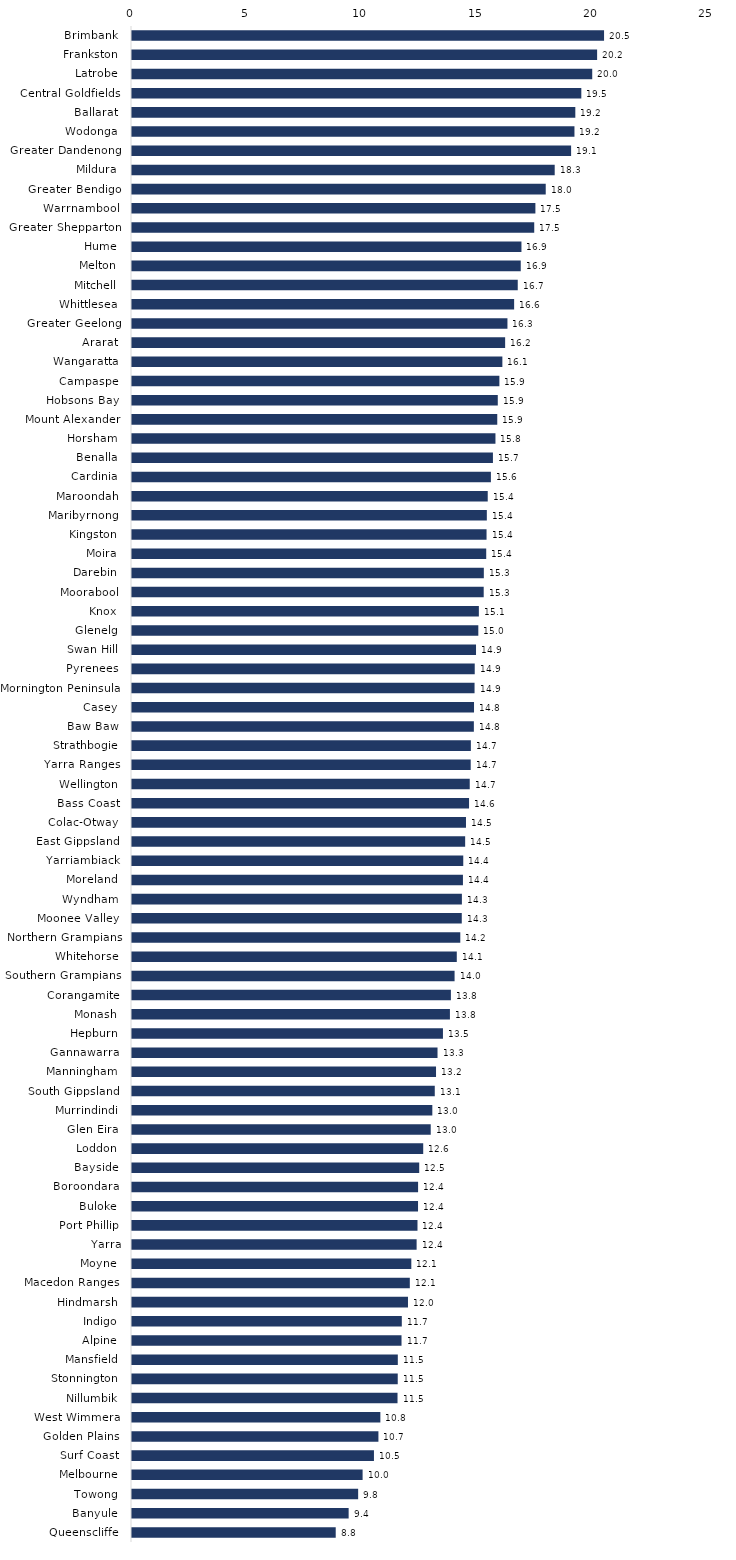
| Category | Series 0 |
|---|---|
| Brimbank  | 20.488 |
| Frankston  | 20.187 |
| Latrobe  | 19.975 |
| Central Goldfields  | 19.502 |
| Ballarat  | 19.241 |
| Wodonga  | 19.204 |
| Greater Dandenong  | 19.058 |
| Mildura  | 18.347 |
| Greater Bendigo  | 17.957 |
| Warrnambool  | 17.508 |
| Greater Shepparton  | 17.458 |
| Hume  | 16.903 |
| Melton  | 16.873 |
| Mitchell  | 16.743 |
| Whittlesea  | 16.586 |
| Greater Geelong  | 16.295 |
| Ararat  | 16.195 |
| Wangaratta  | 16.075 |
| Campaspe  | 15.945 |
| Hobsons Bay  | 15.876 |
| Mount Alexander  | 15.853 |
| Horsham  | 15.775 |
| Benalla  | 15.665 |
| Cardinia  | 15.577 |
| Maroondah  | 15.44 |
| Maribyrnong  | 15.401 |
| Kingston  | 15.388 |
| Moira  | 15.374 |
| Darebin  | 15.271 |
| Moorabool  | 15.265 |
| Knox  | 15.055 |
| Glenelg  | 15.031 |
| Swan Hill  | 14.932 |
| Pyrenees  | 14.876 |
| Mornington Peninsula  | 14.868 |
| Casey  | 14.845 |
| Baw Baw  | 14.838 |
| Strathbogie  | 14.708 |
| Yarra Ranges  | 14.701 |
| Wellington  | 14.659 |
| Bass Coast  | 14.629 |
| Colac-Otway  | 14.496 |
| East Gippsland  | 14.46 |
| Yarriambiack  | 14.378 |
| Moreland  | 14.364 |
| Wyndham  | 14.318 |
| Moonee Valley  | 14.313 |
| Northern Grampians  | 14.249 |
| Whitehorse  | 14.097 |
| Southern Grampians  | 14.001 |
| Corangamite  | 13.841 |
| Monash  | 13.799 |
| Hepburn  | 13.496 |
| Gannawarra  | 13.261 |
| Manningham  | 13.196 |
| South Gippsland  | 13.141 |
| Murrindindi  | 13.035 |
| Glen Eira  | 12.966 |
| Loddon  | 12.64 |
| Bayside  | 12.466 |
| Boroondara  | 12.417 |
| Buloke  | 12.415 |
| Port Phillip  | 12.391 |
| Yarra | 12.353 |
| Moyne  | 12.123 |
| Macedon Ranges  | 12.058 |
| Hindmarsh  | 11.979 |
| Indigo  | 11.71 |
| Alpine  | 11.698 |
| Mansfield  | 11.537 |
| Stonnington  | 11.534 |
| Nillumbik  | 11.525 |
| West Wimmera  | 10.78 |
| Golden Plains  | 10.695 |
| Surf Coast  | 10.502 |
| Melbourne  | 10.009 |
| Towong  | 9.816 |
| Banyule  | 9.403 |
| Queenscliffe  | 8.842 |